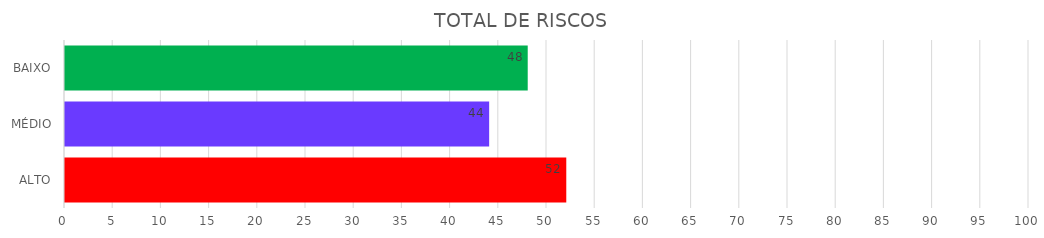
| Category | Series 1 | Series 0 |
|---|---|---|
| ALTO | 52 | 52 |
| MÉDIO | 44 | 44 |
| BAIXO | 48 | 48 |